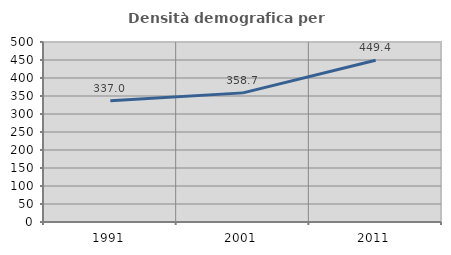
| Category | Densità demografica |
|---|---|
| 1991.0 | 336.995 |
| 2001.0 | 358.68 |
| 2011.0 | 449.392 |